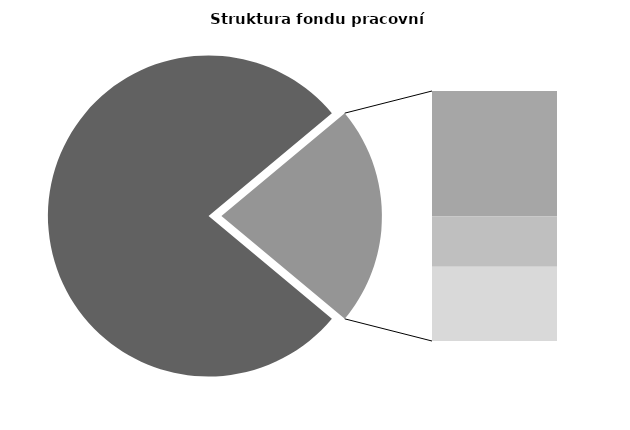
| Category | Series 0 |
|---|---|
| Průměrná měsíční odpracovaná doba bez přesčasu | 134.118 |
| Dovolená | 19.079 |
| Nemoc | 7.708 |
| Jiné | 11.327 |